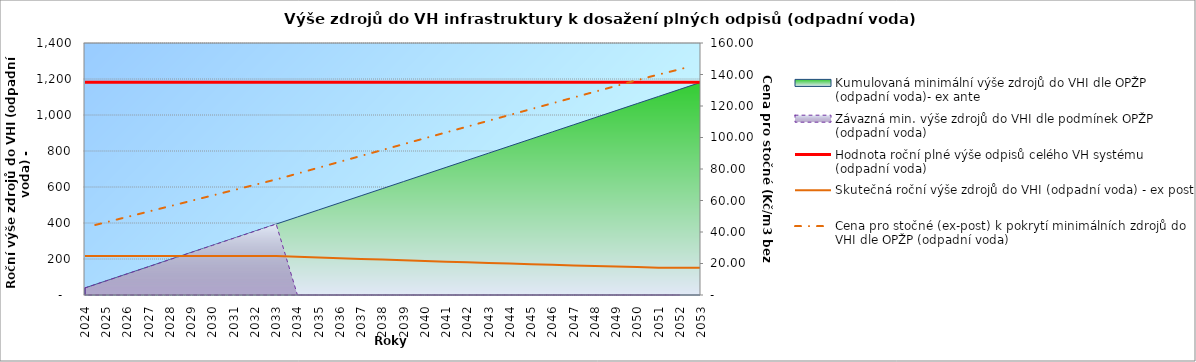
| Category | Hodnota roční plné výše odpisů celého VH systému (odpadní voda) | Skutečná roční výše zdrojů do VHI (odpadní voda) - ex post |
|---|---|---|
| 2024.0 | 1181.916 | 217 |
| 2025.0 | 1181.916 | 217 |
| 2026.0 | 1181.916 | 217 |
| 2027.0 | 1181.916 | 217 |
| 2028.0 | 1181.916 | 217 |
| 2029.0 | 1181.916 | 217 |
| 2030.0 | 1181.916 | 217 |
| 2031.0 | 1181.916 | 217 |
| 2032.0 | 1181.916 | 217 |
| 2033.0 | 1181.916 | 217 |
| 2034.0 | 1181.916 | 212.745 |
| 2035.0 | 1181.916 | 208.574 |
| 2036.0 | 1181.916 | 204.484 |
| 2037.0 | 1181.916 | 200.474 |
| 2038.0 | 1181.916 | 196.544 |
| 2039.0 | 1181.916 | 192.69 |
| 2040.0 | 1181.916 | 188.912 |
| 2041.0 | 1181.916 | 185.207 |
| 2042.0 | 1181.916 | 181.576 |
| 2043.0 | 1181.916 | 178.016 |
| 2044.0 | 1181.916 | 174.525 |
| 2045.0 | 1181.916 | 171.103 |
| 2046.0 | 1181.916 | 167.748 |
| 2047.0 | 1181.916 | 164.459 |
| 2048.0 | 1181.916 | 161.234 |
| 2049.0 | 1181.916 | 158.073 |
| 2050.0 | 1181.916 | 154.973 |
| 2051.0 | 1181.916 | 151.935 |
| 2052.0 | 1181.916 | 151.935 |
| 2053.0 | 1181.916 | 151.935 |